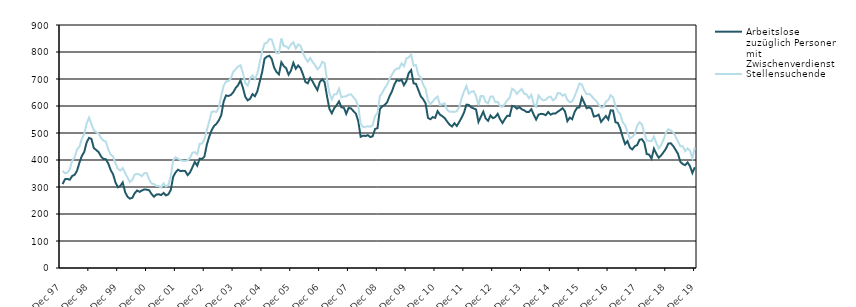
| Category | Arbeitslose zuzüglich Personen mit Zwischenverdienst | Stellensuchende |
|---|---|---|
| 1998-01-01 | 311 | 360 |
| 1998-02-01 | 329 | 351 |
| 1998-03-01 | 330 | 353 |
| 1998-04-01 | 327 | 366 |
| 1998-05-01 | 341 | 398 |
| 1998-06-01 | 345 | 410 |
| 1998-07-01 | 360 | 439 |
| 1998-08-01 | 390 | 449 |
| 1998-09-01 | 415 | 479 |
| 1998-10-01 | 430 | 496 |
| 1998-11-01 | 465 | 535 |
| 1998-12-01 | 482 | 557 |
| 1999-01-01 | 478 | 533 |
| 1999-02-01 | 444 | 510 |
| 1999-03-01 | 437 | 503 |
| 1999-04-01 | 429 | 498 |
| 1999-05-01 | 413 | 481 |
| 1999-06-01 | 404 | 472 |
| 1999-07-01 | 403 | 468 |
| 1999-08-01 | 387 | 439 |
| 1999-09-01 | 363 | 420 |
| 1999-10-01 | 347 | 413 |
| 1999-11-01 | 317 | 387 |
| 1999-12-01 | 299 | 367 |
| 2000-01-01 | 304 | 361 |
| 2000-02-01 | 317 | 370 |
| 2000-03-01 | 281 | 352 |
| 2000-04-01 | 264 | 335 |
| 2000-05-01 | 257 | 318 |
| 2000-06-01 | 260 | 327 |
| 2000-07-01 | 277 | 346 |
| 2000-08-01 | 287 | 349 |
| 2000-09-01 | 282 | 346 |
| 2000-10-01 | 287 | 340 |
| 2000-11-01 | 291 | 351 |
| 2000-12-01 | 290 | 352 |
| 2001-01-01 | 288 | 328 |
| 2001-02-01 | 274 | 313 |
| 2001-03-01 | 264 | 311 |
| 2001-04-01 | 272 | 304 |
| 2001-05-01 | 273 | 304 |
| 2001-06-01 | 270 | 298 |
| 2001-07-01 | 278 | 313 |
| 2001-08-01 | 269 | 302 |
| 2001-09-01 | 273 | 307 |
| 2001-10-01 | 289 | 340 |
| 2001-11-01 | 338 | 399 |
| 2001-12-01 | 354 | 410 |
| 2002-01-01 | 364 | 405 |
| 2002-02-01 | 359 | 400 |
| 2002-03-01 | 360 | 397 |
| 2002-04-01 | 359 | 396 |
| 2002-05-01 | 344 | 399 |
| 2002-06-01 | 354 | 408 |
| 2002-07-01 | 373 | 427 |
| 2002-08-01 | 393 | 429 |
| 2002-09-01 | 379 | 421 |
| 2002-10-01 | 405 | 460 |
| 2002-11-01 | 404 | 461 |
| 2002-12-01 | 413 | 477 |
| 2003-01-01 | 457 | 511 |
| 2003-02-01 | 486 | 543 |
| 2003-03-01 | 510 | 578 |
| 2003-04-01 | 526 | 580 |
| 2003-05-01 | 534 | 578 |
| 2003-06-01 | 547 | 595 |
| 2003-07-01 | 566 | 638 |
| 2003-08-01 | 617 | 675 |
| 2003-09-01 | 639 | 691 |
| 2003-10-01 | 637 | 692 |
| 2003-11-01 | 641 | 703 |
| 2003-12-01 | 651 | 727 |
| 2004-01-01 | 667 | 736 |
| 2004-02-01 | 677 | 746 |
| 2004-03-01 | 695 | 751 |
| 2004-04-01 | 668 | 723 |
| 2004-05-01 | 634 | 684 |
| 2004-06-01 | 621 | 675 |
| 2004-07-01 | 627 | 703 |
| 2004-08-01 | 644 | 713 |
| 2004-09-01 | 636 | 700 |
| 2004-10-01 | 654 | 719 |
| 2004-11-01 | 690 | 760 |
| 2004-12-01 | 725 | 802 |
| 2005-01-01 | 775 | 831 |
| 2005-02-01 | 783 | 834 |
| 2005-03-01 | 786 | 848 |
| 2005-04-01 | 774 | 846 |
| 2005-05-01 | 742 | 817 |
| 2005-06-01 | 726 | 795 |
| 2005-07-01 | 717 | 796 |
| 2005-08-01 | 762 | 850 |
| 2005-09-01 | 748 | 822 |
| 2005-10-01 | 740 | 821 |
| 2005-11-01 | 716 | 813 |
| 2005-12-01 | 731 | 828 |
| 2006-01-01 | 760 | 836 |
| 2006-02-01 | 738 | 813 |
| 2006-03-01 | 750 | 828 |
| 2006-04-01 | 740 | 823 |
| 2006-05-01 | 717 | 796 |
| 2006-06-01 | 689 | 778 |
| 2006-07-01 | 684 | 764 |
| 2006-08-01 | 704 | 778 |
| 2006-09-01 | 691 | 763 |
| 2006-10-01 | 674 | 752 |
| 2006-11-01 | 659 | 736 |
| 2006-12-01 | 689 | 744 |
| 2007-01-01 | 699 | 764 |
| 2007-02-01 | 688 | 759 |
| 2007-03-01 | 636 | 697 |
| 2007-04-01 | 589 | 648 |
| 2007-05-01 | 573 | 625 |
| 2007-06-01 | 592 | 643 |
| 2007-07-01 | 603 | 644 |
| 2007-08-01 | 617 | 664 |
| 2007-09-01 | 595 | 632 |
| 2007-10-01 | 594 | 635 |
| 2007-11-01 | 571 | 636 |
| 2007-12-01 | 593 | 642 |
| 2008-01-01 | 591 | 643 |
| 2008-02-01 | 581 | 632 |
| 2008-03-01 | 572 | 622 |
| 2008-04-01 | 544 | 598 |
| 2008-05-01 | 486 | 534 |
| 2008-06-01 | 490 | 522 |
| 2008-07-01 | 489 | 523 |
| 2008-08-01 | 492 | 525 |
| 2008-09-01 | 485 | 523 |
| 2008-10-01 | 488 | 529 |
| 2008-11-01 | 515 | 563 |
| 2008-12-01 | 518 | 574 |
| 2009-01-01 | 589 | 637 |
| 2009-02-01 | 599 | 648 |
| 2009-03-01 | 604 | 667 |
| 2009-04-01 | 614 | 678 |
| 2009-05-01 | 636 | 701 |
| 2009-06-01 | 654 | 715 |
| 2009-07-01 | 679 | 731 |
| 2009-08-01 | 696 | 739 |
| 2009-09-01 | 693 | 739 |
| 2009-10-01 | 697 | 758 |
| 2009-11-01 | 677 | 747 |
| 2009-12-01 | 692 | 776 |
| 2010-01-01 | 722 | 780 |
| 2010-02-01 | 733 | 791 |
| 2010-03-01 | 684 | 749 |
| 2010-04-01 | 682 | 752 |
| 2010-05-01 | 659 | 715 |
| 2010-06-01 | 636 | 705 |
| 2010-07-01 | 625 | 679 |
| 2010-08-01 | 610 | 664 |
| 2010-09-01 | 556 | 620 |
| 2010-10-01 | 551 | 606 |
| 2010-11-01 | 559 | 617 |
| 2010-12-01 | 556 | 628 |
| 2011-01-01 | 581 | 635 |
| 2011-02-01 | 568 | 604 |
| 2011-03-01 | 562 | 607 |
| 2011-04-01 | 555 | 610 |
| 2011-05-01 | 542 | 585 |
| 2011-06-01 | 531 | 579 |
| 2011-07-01 | 524 | 579 |
| 2011-08-01 | 536 | 578 |
| 2011-09-01 | 526 | 581 |
| 2011-10-01 | 541 | 596 |
| 2011-11-01 | 557 | 628 |
| 2011-12-01 | 576 | 654 |
| 2012-01-01 | 605 | 674 |
| 2012-02-01 | 604 | 646 |
| 2012-03-01 | 595 | 653 |
| 2012-04-01 | 591 | 655 |
| 2012-05-01 | 587 | 637 |
| 2012-06-01 | 541 | 603 |
| 2012-07-01 | 560 | 637 |
| 2012-08-01 | 579 | 637 |
| 2012-09-01 | 554 | 615 |
| 2012-10-01 | 545 | 610 |
| 2012-11-01 | 565 | 635 |
| 2012-12-01 | 555 | 635 |
| 2013-01-01 | 559 | 614 |
| 2013-02-01 | 571 | 616 |
| 2013-03-01 | 551 | 600 |
| 2013-04-01 | 537 | 597 |
| 2013-05-01 | 552 | 608 |
| 2013-06-01 | 564 | 622 |
| 2013-07-01 | 563 | 631 |
| 2013-08-01 | 600 | 664 |
| 2013-09-01 | 598 | 658 |
| 2013-10-01 | 590 | 645 |
| 2013-11-01 | 596 | 655 |
| 2013-12-01 | 588 | 663 |
| 2014-01-01 | 584 | 646 |
| 2014-02-01 | 578 | 643 |
| 2014-03-01 | 578 | 629 |
| 2014-04-01 | 588 | 641 |
| 2014-05-01 | 568 | 607 |
| 2014-06-01 | 550 | 598 |
| 2014-07-01 | 568 | 639 |
| 2014-08-01 | 571 | 627 |
| 2014-09-01 | 570 | 621 |
| 2014-10-01 | 566 | 623 |
| 2014-11-01 | 578 | 632 |
| 2014-12-01 | 568 | 635 |
| 2015-01-01 | 572 | 621 |
| 2015-02-01 | 572 | 627 |
| 2015-03-01 | 579 | 648 |
| 2015-04-01 | 585 | 647 |
| 2015-05-01 | 592 | 638 |
| 2015-06-01 | 580 | 643 |
| 2015-07-01 | 544 | 623 |
| 2015-08-01 | 557 | 614 |
| 2015-09-01 | 551 | 617 |
| 2015-10-01 | 578 | 636 |
| 2015-11-01 | 593 | 659 |
| 2015-12-01 | 595 | 683 |
| 2016-01-01 | 631 | 680 |
| 2016-02-01 | 612 | 658 |
| 2016-03-01 | 592 | 644 |
| 2016-04-01 | 595 | 645 |
| 2016-05-01 | 590 | 638 |
| 2016-06-01 | 561 | 626 |
| 2016-07-01 | 563 | 619 |
| 2016-08-01 | 568 | 605 |
| 2016-09-01 | 541 | 594 |
| 2016-10-01 | 552 | 595 |
| 2016-11-01 | 563 | 616 |
| 2016-12-01 | 550 | 622 |
| 2017-01-01 | 584 | 640 |
| 2017-02-01 | 583 | 632 |
| 2017-03-01 | 540 | 600 |
| 2017-04-01 | 537 | 580 |
| 2017-05-01 | 516 | 570 |
| 2017-06-01 | 485 | 540 |
| 2017-07-01 | 459 | 529 |
| 2017-08-01 | 470 | 503 |
| 2017-09-01 | 446 | 479 |
| 2017-10-01 | 439 | 486 |
| 2017-11-01 | 451 | 495 |
| 2017-12-01 | 455 | 527 |
| 2018-01-01 | 475 | 540 |
| 2018-02-01 | 477 | 532 |
| 2018-03-01 | 464 | 500 |
| 2018-04-01 | 422 | 473 |
| 2018-05-01 | 420 | 471 |
| 2018-06-01 | 405 | 470 |
| 2018-07-01 | 442 | 487 |
| 2018-08-01 | 423 | 462 |
| 2018-09-01 | 408 | 443 |
| 2018-10-01 | 417 | 455 |
| 2018-11-01 | 429 | 476 |
| 2018-12-01 | 442 | 502 |
| 2019-01-01 | 461 | 514 |
| 2019-02-01 | 462 | 509 |
| 2019-03-01 | 452 | 503 |
| 2019-04-01 | 438 | 487 |
| 2019-05-01 | 423 | 469 |
| 2019-06-01 | 393 | 451 |
| 2019-07-01 | 385 | 451 |
| 2019-08-01 | 381 | 433 |
| 2019-09-01 | 391 | 443 |
| 2019-10-01 | 377 | 435 |
| 2019-11-01 | 352 | 407 |
| 2019-12-01 | 373 | 446 |